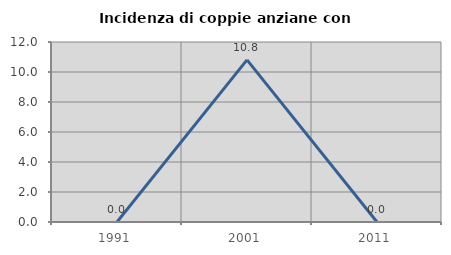
| Category | Incidenza di coppie anziane con figli |
|---|---|
| 1991.0 | 0 |
| 2001.0 | 10.811 |
| 2011.0 | 0 |